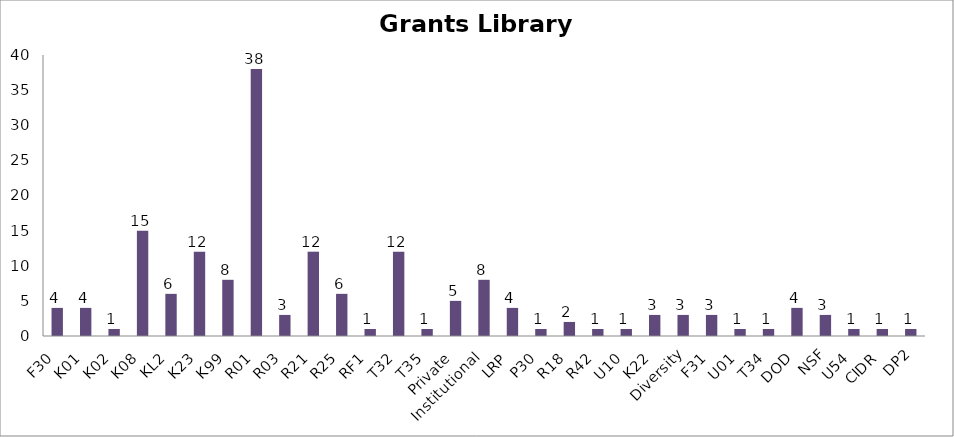
| Category | Number |
|---|---|
| F30 | 4 |
| K01 | 4 |
| K02 | 1 |
| K08 | 15 |
| KL2 | 6 |
| K23 | 12 |
| K99 | 8 |
| R01 | 38 |
| R03 | 3 |
| R21 | 12 |
| R25 | 6 |
| RF1 | 1 |
| T32 | 12 |
| T35 | 1 |
| Private | 5 |
| Institutional | 8 |
| LRP | 4 |
| P30 | 1 |
| R18 | 2 |
| R42 | 1 |
| U10 | 1 |
| K22 | 3 |
| Diversity | 3 |
| F31 | 3 |
| U01 | 1 |
| T34 | 1 |
| DOD | 4 |
| NSF | 3 |
| U54 | 1 |
| CIDR | 1 |
| DP2 | 1 |